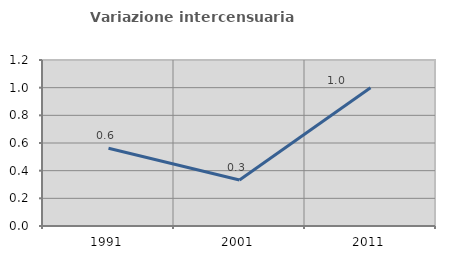
| Category | Variazione intercensuaria annua |
|---|---|
| 1991.0 | 0.562 |
| 2001.0 | 0.333 |
| 2011.0 | 1 |